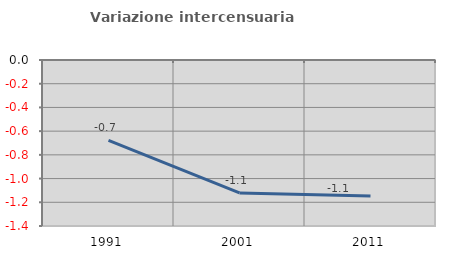
| Category | Variazione intercensuaria annua |
|---|---|
| 1991.0 | -0.678 |
| 2001.0 | -1.121 |
| 2011.0 | -1.147 |